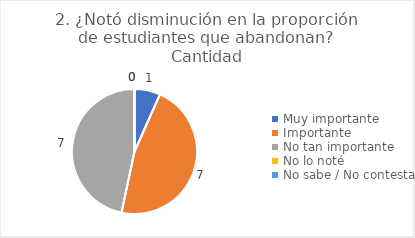
| Category | 2. ¿Notó disminución en la proporción de estudiantes que abandonan? |
|---|---|
| Muy importante  | 0.067 |
| Importante  | 0.467 |
| No tan importante  | 0.467 |
| No lo noté  | 0 |
| No sabe / No contesta | 0 |